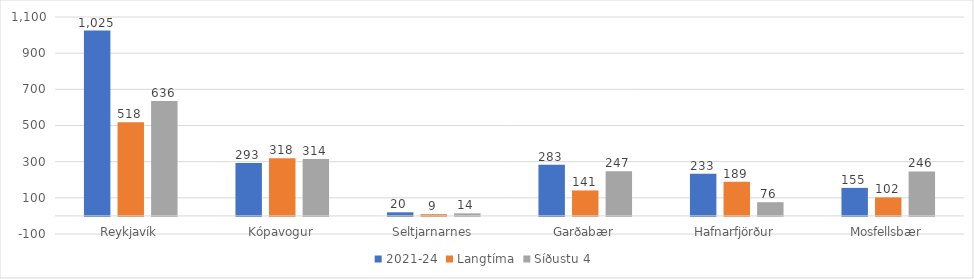
| Category | 2021-24 | Langtíma | Síðustu 4  |
|---|---|---|---|
| Reykjavík | 1025 | 518.44 | 635.5 |
| Kópavogur | 292.5 | 318.32 | 314.25 |
| Seltjarnarnes | 20 | 9.48 | 14.25 |
| Garðabær | 282.5 | 140.84 | 246.75 |
| Hafnarfjörður | 232.5 | 188.76 | 75.75 |
| Mosfellsbær | 155 | 102.32 | 246 |